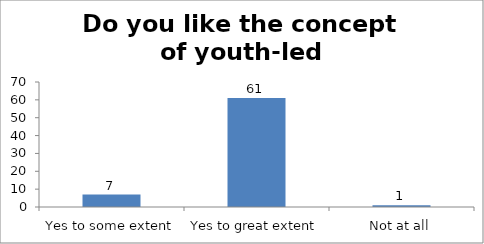
| Category | Do you like the concept of youth-led changemaking?  |
|---|---|
| Yes to some extent | 7 |
| Yes to great extent | 61 |
| Not at all | 1 |